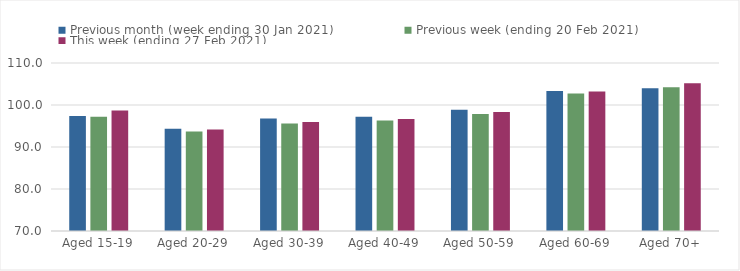
| Category | Previous month (week ending 30 Jan 2021) | Previous week (ending 20 Feb 2021) | This week (ending 27 Feb 2021) |
|---|---|---|---|
| Aged 15-19 | 97.39 | 97.18 | 98.7 |
| Aged 20-29 | 94.33 | 93.71 | 94.16 |
| Aged 30-39 | 96.78 | 95.6 | 95.96 |
| Aged 40-49 | 97.19 | 96.28 | 96.66 |
| Aged 50-59 | 98.84 | 97.86 | 98.35 |
| Aged 60-69 | 103.35 | 102.75 | 103.2 |
| Aged 70+ | 103.97 | 104.22 | 105.17 |